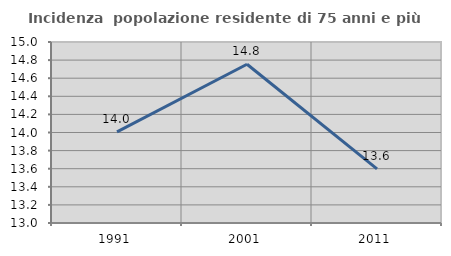
| Category | Incidenza  popolazione residente di 75 anni e più |
|---|---|
| 1991.0 | 14.008 |
| 2001.0 | 14.754 |
| 2011.0 | 13.597 |